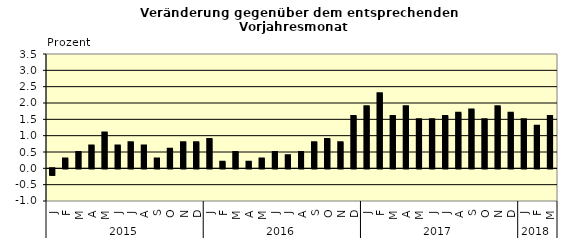
| Category | Series 0 |
|---|---|
| 0 | -0.2 |
| 1 | 0.3 |
| 2 | 0.5 |
| 3 | 0.7 |
| 4 | 1.1 |
| 5 | 0.7 |
| 6 | 0.8 |
| 7 | 0.7 |
| 8 | 0.3 |
| 9 | 0.6 |
| 10 | 0.8 |
| 11 | 0.8 |
| 12 | 0.9 |
| 13 | 0.2 |
| 14 | 0.5 |
| 15 | 0.2 |
| 16 | 0.3 |
| 17 | 0.5 |
| 18 | 0.4 |
| 19 | 0.5 |
| 20 | 0.8 |
| 21 | 0.9 |
| 22 | 0.8 |
| 23 | 1.6 |
| 24 | 1.9 |
| 25 | 2.3 |
| 26 | 1.6 |
| 27 | 1.9 |
| 28 | 1.5 |
| 29 | 1.5 |
| 30 | 1.6 |
| 31 | 1.7 |
| 32 | 1.8 |
| 33 | 1.5 |
| 34 | 1.9 |
| 35 | 1.7 |
| 36 | 1.5 |
| 37 | 1.3 |
| 38 | 1.6 |